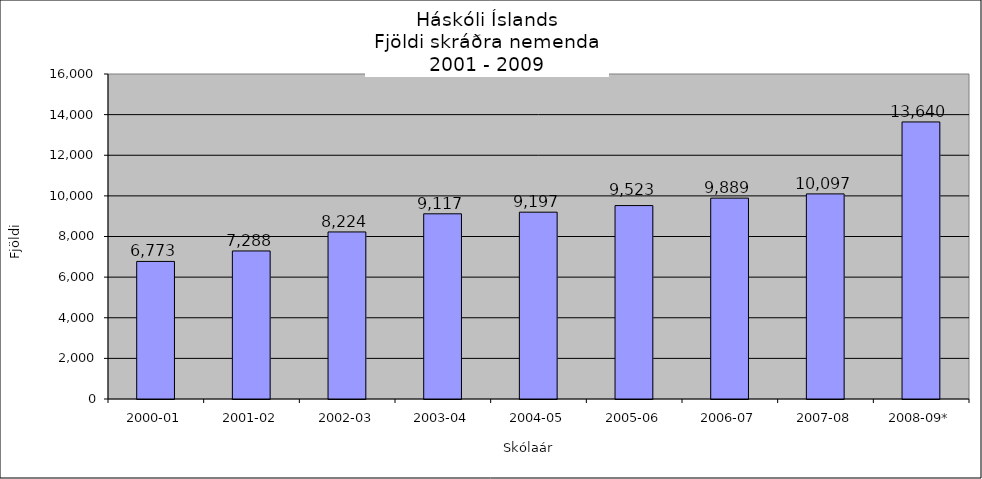
| Category | Series 0 |
|---|---|
| 2000-01 | 6773 |
| 2001-02 | 7288 |
| 2002-03 | 8224 |
| 2003-04 | 9117 |
| 2004-05 | 9197 |
| 2005-06 | 9523 |
| 2006-07 | 9889 |
| 2007-08 | 10097 |
| 2008-09* | 13640 |